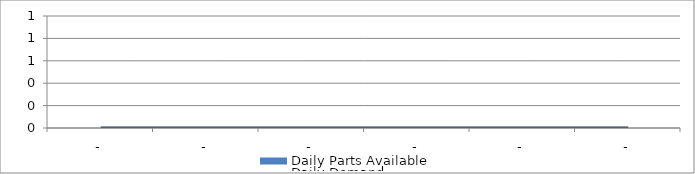
| Category | Daily Parts Available |
|---|---|
| - | 0 |
| - | 0 |
| - | 0 |
| - | 0 |
| - | 0 |
| - | 0 |